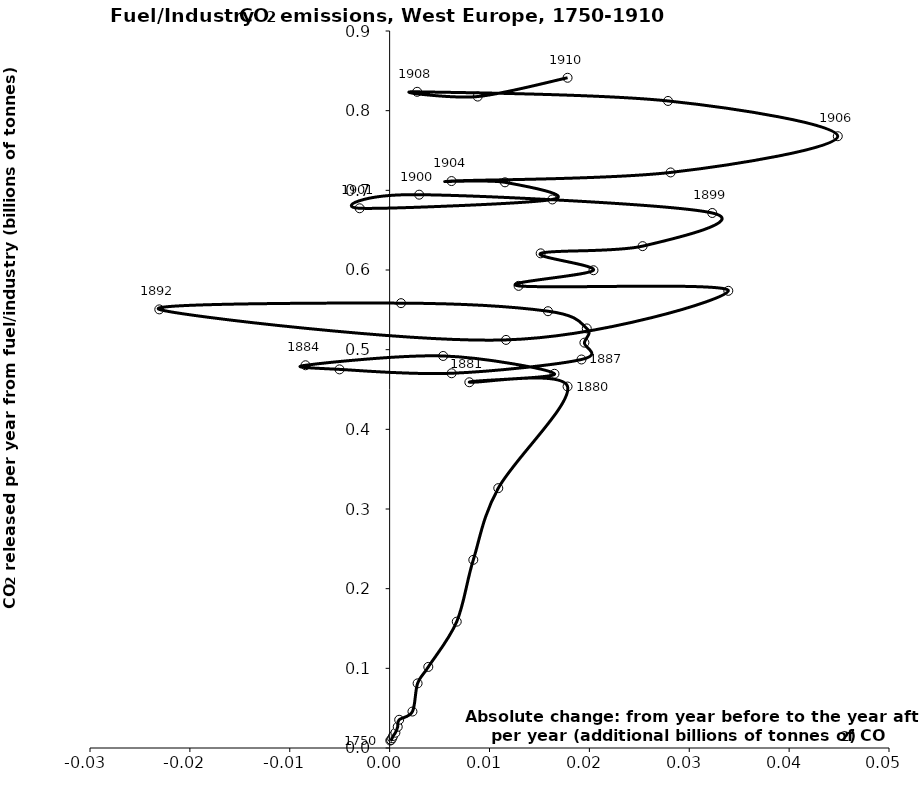
| Category | Series 0 |
|---|---|
| 6.668479999999993e-05 | 0.009 |
| 0.00014619360000000004 | 0.01 |
| 0.00025190000000000005 | 0.012 |
| 0.0003449655999999999 | 0.015 |
| 0.0005789120000000001 | 0.019 |
| 0.0008119424000000002 | 0.027 |
| 0.000956304 | 0.035 |
| 0.0022854200000000002 | 0.046 |
| 0.0028009448 | 0.081 |
| 0.0038732144000000004 | 0.102 |
| 0.0067195928 | 0.159 |
| 0.008379018399999999 | 0.236 |
| 0.010878599200000002 | 0.326 |
| 0.01781619999999995 | 0.454 |
| 0.007982024000000004 | 0.459 |
| 0.016506320000000047 | 0.47 |
| 0.005358599999999963 | 0.492 |
| -0.008421704000000058 | 0.48 |
| -0.005019679999999971 | 0.475 |
| 0.006206816000000004 | 0.47 |
| 0.01920851999999998 | 0.488 |
| 0.01950347200000002 | 0.509 |
| 0.019737967999999995 | 0.527 |
| 0.015855960000000002 | 0.548 |
| 0.0011413360000000483 | 0.558 |
| -0.023061215999999995 | 0.551 |
| 0.011655183999999985 | 0.512 |
| 0.033910319999999994 | 0.574 |
| 0.012911936000000013 | 0.58 |
| 0.020410311999999986 | 0.6 |
| 0.015124992000000004 | 0.621 |
| 0.025329232000000035 | 0.63 |
| 0.032303656000000014 | 0.672 |
| 0.002956848000000012 | 0.695 |
| -0.003002648000000052 | 0.677 |
| 0.01629014399999995 | 0.689 |
| 0.011548928000000014 | 0.71 |
| 0.006197655999999996 | 0.712 |
| 0.02813402399999998 | 0.722 |
| 0.04487300800000005 | 0.768 |
| 0.027873880000000018 | 0.812 |
| 0.0027553280000000013 | 0.824 |
| 0.008817416000000022 | 0.818 |
| 0.01781619999999995 | 0.841 |